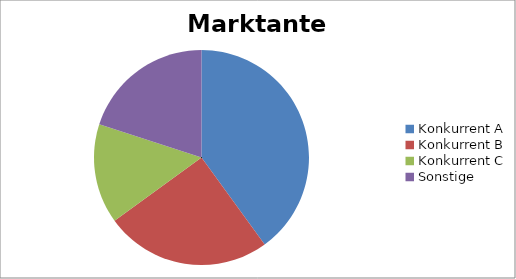
| Category | Marktanteil |
|---|---|
| Konkurrent A | 0.4 |
| Konkurrent B | 0.25 |
| Konkurrent C | 0.15 |
| Sonstige | 0.2 |